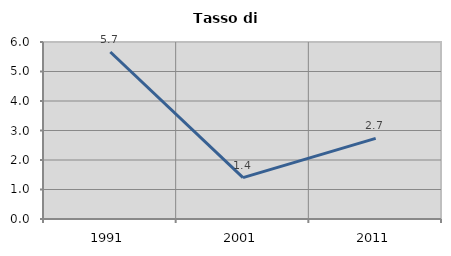
| Category | Tasso di disoccupazione   |
|---|---|
| 1991.0 | 5.66 |
| 2001.0 | 1.402 |
| 2011.0 | 2.732 |